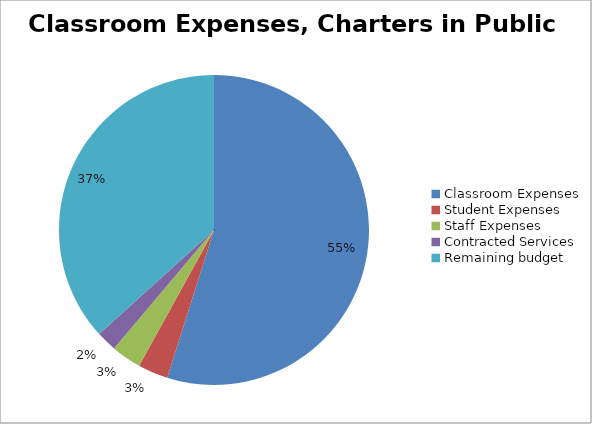
| Category | Series 0 |
|---|---|
| Classroom Expenses | 9957.69 |
| Student Expenses | 570.242 |
| Staff Expenses | 570.242 |
| Contracted Services | 382.56 |
| Remaining budget  | 6662.956 |